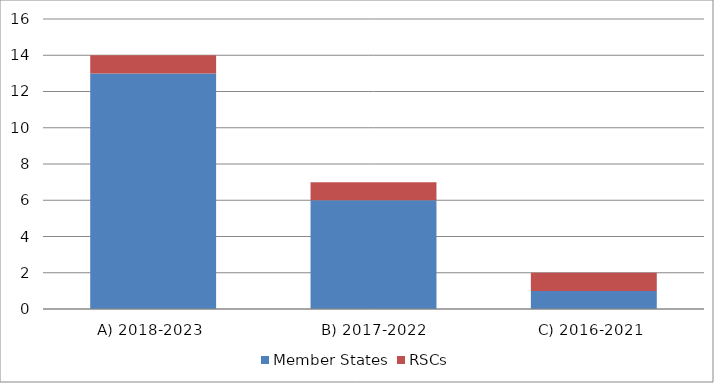
| Category | Member States | RSCs |
|---|---|---|
| A) 2018-2023  | 13 | 1 |
| B) 2017-2022 | 6 | 1 |
| C) 2016-2021  | 1 | 1 |